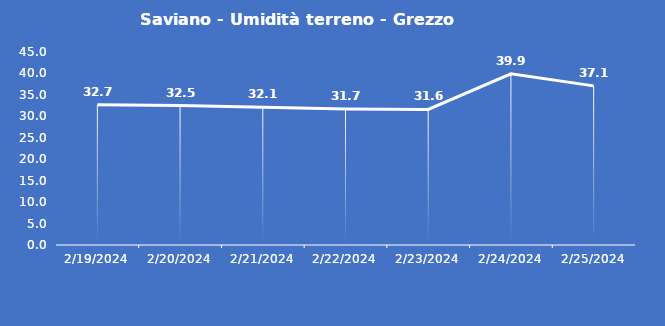
| Category | Saviano - Umidità terreno - Grezzo (%VWC) |
|---|---|
| 2/19/24 | 32.7 |
| 2/20/24 | 32.5 |
| 2/21/24 | 32.1 |
| 2/22/24 | 31.7 |
| 2/23/24 | 31.6 |
| 2/24/24 | 39.9 |
| 2/25/24 | 37.1 |